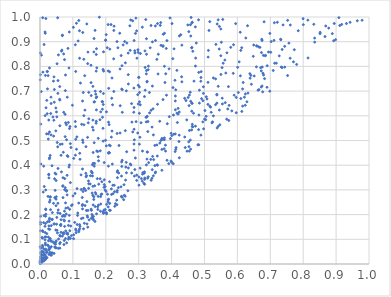
| Category | Series 0 |
|---|---|
| 0.5119025877408926 | 0.865 |
| 0.4126539866589853 | 0.464 |
| 0.009565070195917147 | 0.022 |
| 0.5110437259262518 | 0.838 |
| 0.26343760605690314 | 0.455 |
| 0.04818512540377783 | 0.632 |
| 0.31847032164182726 | 0.348 |
| 0.4196648750307523 | 0.607 |
| 0.37221815655606694 | 0.504 |
| 0.3252234285979464 | 0.737 |
| 0.4578985301840214 | 0.465 |
| 0.1725142587305596 | 0.677 |
| 0.0037070343712594517 | 0.016 |
| 0.0728381030565067 | 0.178 |
| 0.18586488468396364 | 0.281 |
| 0.5468149584931802 | 0.564 |
| 0.3110965996179899 | 0.335 |
| 0.3782162829624918 | 0.8 |
| 0.018305680623724792 | 0.632 |
| 0.07234310696253618 | 0.127 |
| 0.27947726100723885 | 0.575 |
| 0.5829646561322925 | 0.62 |
| 0.12295013277099939 | 0.733 |
| 0.274148199250739 | 0.865 |
| 0.24808586120000017 | 0.413 |
| 0.10850868623535385 | 0.78 |
| 0.1203393513211631 | 0.16 |
| 0.0896639272993858 | 0.548 |
| 0.28689535963270074 | 0.356 |
| 0.02921057819102696 | 0.43 |
| 0.16715190988454232 | 0.172 |
| 0.48984421801418226 | 0.779 |
| 0.04484551768862694 | 0.268 |
| 0.01579565165165343 | 0.127 |
| 0.4542212703960004 | 0.54 |
| 0.025391776370436273 | 0.527 |
| 0.016611433516440854 | 0.164 |
| 0.4627031396345181 | 0.65 |
| 0.16830707266852046 | 0.289 |
| 0.39629480736686873 | 0.508 |
| 0.5727819457750162 | 0.718 |
| 0.16057743324149176 | 0.278 |
| 0.285822041818848 | 0.634 |
| 0.12163234444274439 | 0.424 |
| 0.9790710817109156 | 0.987 |
| 0.3445888609127008 | 0.357 |
| 0.26216488195021453 | 0.412 |
| 0.37046815945160294 | 0.464 |
| 0.0016464650899225299 | 0.045 |
| 0.10656667648574371 | 0.286 |
| 0.006076138489974972 | 0.036 |
| 0.29850312595106554 | 0.648 |
| 0.6596730757829257 | 0.883 |
| 0.7997433507426633 | 0.993 |
| 0.10856643164775959 | 0.505 |
| 0.24748910148861322 | 0.274 |
| 0.4608443652437571 | 0.875 |
| 0.06047659159965289 | 0.064 |
| 0.6985067056871446 | 0.7 |
| 0.005953391851341842 | 0.107 |
| 0.0013565403542534341 | 0.014 |
| 0.5796616221465702 | 0.877 |
| 0.1804670981968877 | 0.999 |
| 0.019672254525324374 | 0.045 |
| 0.19841442980352123 | 0.221 |
| 0.1647067813303495 | 0.491 |
| 0.054708043080989394 | 0.743 |
| 0.14738743690725672 | 0.336 |
| 0.08935802420370768 | 0.401 |
| 0.07789127826838671 | 0.572 |
| 0.2367691939130765 | 0.875 |
| 0.4279017837008784 | 0.928 |
| 0.001234815517246652 | 0.134 |
| 0.7333494051140961 | 0.798 |
| 0.1333625994295932 | 0.601 |
| 0.1556380530285394 | 0.682 |
| 0.31589857928697695 | 0.326 |
| 0.08907305338222854 | 0.939 |
| 0.03489830999570762 | 0.092 |
| 0.19476019123073157 | 0.31 |
| 0.7112491979636713 | 0.905 |
| 0.5337613130346864 | 0.749 |
| 0.4613010239611775 | 0.619 |
| 0.36767456002003196 | 0.885 |
| 0.024291158913326137 | 0.274 |
| 0.19353175272078613 | 0.781 |
| 0.35659216999408416 | 0.437 |
| 0.0504433772494215 | 0.161 |
| 0.037685639439198455 | 0.208 |
| 0.2019842502042744 | 0.616 |
| 0.0022177023693992896 | 0.029 |
| 0.26083696338702 | 0.392 |
| 0.30212136470536155 | 0.485 |
| 0.3490182135243095 | 0.48 |
| 0.03702994257538821 | 0.18 |
| 0.5496973995938144 | 0.951 |
| 0.16431018351470741 | 0.913 |
| 0.00936817803683666 | 0.049 |
| 0.17103427520904388 | 0.848 |
| 0.3423506517497918 | 0.436 |
| 0.35878481380429406 | 0.769 |
| 0.2466917180414053 | 0.844 |
| 0.8944369424244668 | 0.974 |
| 0.06924895719642772 | 0.315 |
| 0.32726675822444207 | 0.348 |
| 0.43122927210652023 | 0.738 |
| 0.41127632143356513 | 0.66 |
| 0.019184857617721398 | 0.024 |
| 0.04431614382526744 | 0.345 |
| 0.28511302120442533 | 0.614 |
| 0.21589934618522266 | 0.969 |
| 0.2206314947919599 | 0.645 |
| 0.6510553493207257 | 0.761 |
| 0.011408317524876598 | 0.04 |
| 0.1618849035566547 | 0.542 |
| 0.3195991598963953 | 0.796 |
| 0.5105287988795942 | 0.646 |
| 0.3375737268340092 | 0.622 |
| 0.1754787284788721 | 0.455 |
| 0.14525638391060747 | 0.149 |
| 0.046558848661996347 | 0.068 |
| 0.14829771224872174 | 0.588 |
| 0.5620073145155606 | 0.826 |
| 0.30055819434844294 | 0.353 |
| 0.42327753017190967 | 0.615 |
| 0.11259605728469026 | 0.305 |
| 0.03651286200454346 | 0.398 |
| 0.0678462303275696 | 0.193 |
| 0.13300506415104935 | 0.305 |
| 0.35029162363015987 | 0.369 |
| 0.3402792603256351 | 0.347 |
| 0.3047734682660579 | 0.644 |
| 0.46808479414933096 | 0.74 |
| 0.5901718343891207 | 0.684 |
| 0.03350304918064729 | 0.092 |
| 0.35128403105923384 | 0.372 |
| 0.24866063459613566 | 0.395 |
| 0.002175744603686815 | 0.013 |
| 0.2169820490102558 | 0.304 |
| 0.243396539881631 | 0.79 |
| 0.32363610158967593 | 0.912 |
| 0.16574320402932008 | 0.657 |
| 0.10037754382586764 | 0.276 |
| 0.19315776367517873 | 0.859 |
| 0.6008149948747821 | 0.796 |
| 0.17249901423390793 | 0.458 |
| 0.6825538331252522 | 0.75 |
| 0.6256434530778168 | 0.915 |
| 0.2969572194009828 | 0.686 |
| 0.6779118630819716 | 0.772 |
| 0.6904783352809722 | 0.803 |
| 0.32561454310275517 | 0.454 |
| 0.45317856173937 | 0.641 |
| 0.05988923456390162 | 0.082 |
| 0.18870209021765158 | 0.657 |
| 0.25008428494351215 | 0.614 |
| 0.1707601973236729 | 0.781 |
| 0.010969449563899175 | 0.061 |
| 0.011510134957108684 | 0.012 |
| 0.000634772903669578 | 0.745 |
| 0.32146519776981475 | 0.99 |
| 0.048131820807391486 | 0.539 |
| 0.1294279070607893 | 0.66 |
| 0.4629860186901766 | 0.566 |
| 0.31746814972877174 | 0.373 |
| 0.12654097333734443 | 0.566 |
| 0.015963590846686394 | 0.035 |
| 0.077590350434737 | 0.765 |
| 0.015093066693773978 | 0.098 |
| 0.022567888732393526 | 0.171 |
| 0.24335558166347268 | 0.53 |
| 0.21133650093689743 | 0.45 |
| 0.008509884561067107 | 0.017 |
| 0.09583245536882434 | 0.236 |
| 0.6751061256750083 | 0.721 |
| 0.3349269679017548 | 0.875 |
| 0.2882341894508651 | 0.382 |
| 0.27572822288756726 | 0.988 |
| 0.17422953321207452 | 0.346 |
| 0.1581148729453198 | 0.201 |
| 0.0017424470095674545 | 0.161 |
| 0.017451511756296743 | 0.3 |
| 0.32812639666877363 | 0.577 |
| 0.15920163837227053 | 0.193 |
| 0.5001576625644056 | 0.586 |
| 0.1334470557814857 | 0.564 |
| 0.010561033039289652 | 0.022 |
| 0.6378051133069329 | 0.771 |
| 0.07181401330751351 | 0.197 |
| 0.355350693647943 | 0.482 |
| 0.3287728596513116 | 0.787 |
| 0.24987419152793955 | 0.42 |
| 0.06999707294775914 | 0.349 |
| 0.7437056594063286 | 0.881 |
| 0.4582626013621017 | 0.923 |
| 0.11222389191679469 | 0.515 |
| 0.0004094471046502594 | 0.006 |
| 0.29704878189023626 | 0.53 |
| 0.06829277579353878 | 0.927 |
| 0.23535272719405595 | 0.35 |
| 0.02885492335061019 | 0.251 |
| 0.5568066794734551 | 0.813 |
| 0.08893670172724344 | 0.197 |
| 0.48918071617833 | 0.522 |
| 0.04605715228672384 | 0.298 |
| 0.034193374601481044 | 0.155 |
| 0.17077007647185646 | 0.673 |
| 0.1609634303104892 | 0.185 |
| 0.24775334432427526 | 0.356 |
| 0.32893969138008683 | 0.353 |
| 0.13672651494532534 | 0.237 |
| 0.020110833533931973 | 0.527 |
| 0.28606152891036085 | 0.905 |
| 0.3738828906497835 | 0.666 |
| 0.025860534814779033 | 0.094 |
| 0.02658701137931254 | 0.363 |
| 0.08229236357473423 | 0.359 |
| 0.44936067356709053 | 0.968 |
| 0.14664094945386152 | 0.572 |
| 0.078304741175579 | 0.134 |
| 0.15942076680695513 | 0.402 |
| 0.44688629968107707 | 0.457 |
| 0.09788297940522495 | 0.24 |
| 0.13880042345691715 | 0.298 |
| 0.4617195260707267 | 0.877 |
| 0.21159388410347926 | 0.778 |
| 0.24014334994346037 | 0.48 |
| 0.18411029880315963 | 0.273 |
| 0.34165904285021714 | 0.72 |
| 0.2937941573973862 | 0.944 |
| 0.19779035479122012 | 0.208 |
| 0.5226439983433782 | 0.571 |
| 0.6685328697633524 | 0.877 |
| 0.04859044073026692 | 0.364 |
| 0.5376881155498591 | 0.684 |
| 0.08806487028936098 | 0.794 |
| 0.35690907987920967 | 0.4 |
| 0.6290411551457933 | 0.657 |
| 0.01635333483061353 | 0.085 |
| 0.1396870174083389 | 0.475 |
| 0.08300653029646834 | 0.439 |
| 0.6788843607868364 | 0.845 |
| 0.41257128233706925 | 0.705 |
| 0.23938473791691262 | 0.369 |
| 0.04953939197256884 | 0.272 |
| 0.6054033873471087 | 0.818 |
| 0.0848530957636437 | 0.435 |
| 0.19540722660060675 | 0.341 |
| 0.15885289725910082 | 0.369 |
| 0.1359016842380897 | 0.762 |
| 0.04736478461801026 | 0.067 |
| 0.20825882559556472 | 0.574 |
| 0.015097992891398179 | 0.153 |
| 0.4114345386220272 | 0.624 |
| 0.047341125564339316 | 0.08 |
| 0.615787714321102 | 0.709 |
| 0.608608995438262 | 0.938 |
| 0.07261461626549706 | 0.195 |
| 0.0037092628443344392 | 0.038 |
| 0.4197337137702663 | 0.63 |
| 0.5385244127317804 | 0.972 |
| 0.12870722507320292 | 0.237 |
| 0.6158882950862178 | 0.639 |
| 0.9084582696357356 | 0.997 |
| 0.8686328156433936 | 0.964 |
| 0.4111217828533446 | 0.527 |
| 0.3378344836950024 | 0.339 |
| 0.08019275508652228 | 0.564 |
| 0.23451624136996813 | 0.291 |
| 0.05542225644329267 | 0.063 |
| 0.2859997025382632 | 0.546 |
| 0.45681433683045963 | 0.502 |
| 0.47313437390219715 | 0.834 |
| 0.10979007905057604 | 0.127 |
| 0.2198310927938417 | 0.405 |
| 0.06972292640425558 | 0.317 |
| 0.684582309048272 | 0.843 |
| 0.2820052518222499 | 0.535 |
| 0.3265573601942448 | 0.453 |
| 0.12575853301448808 | 0.184 |
| 0.0921986203524551 | 0.104 |
| 0.07523479873742782 | 0.346 |
| 0.10966145839791895 | 0.136 |
| 0.21690603127646965 | 0.514 |
| 0.003041274448268504 | 0.031 |
| 0.20724089320595857 | 0.782 |
| 0.38221944033213073 | 0.77 |
| 0.6767941329025524 | 0.697 |
| 0.18277274220359033 | 0.345 |
| 0.37730452201460235 | 0.466 |
| 0.5498374390066204 | 0.767 |
| 0.45929689717699257 | 0.998 |
| 0.17267062664732796 | 0.794 |
| 0.6385926261290008 | 0.752 |
| 0.02666965647037719 | 0.583 |
| 0.10545570669132319 | 0.168 |
| 0.1434974990030883 | 0.195 |
| 0.0002648203481736067 | 0.011 |
| 0.10240622116886718 | 0.427 |
| 0.4612595828787801 | 0.651 |
| 0.1832593185785308 | 0.458 |
| 0.34059213466303684 | 0.554 |
| 0.21744186823131226 | 0.282 |
| 0.034350206548688464 | 0.07 |
| 0.2348164054516113 | 0.297 |
| 0.28534650953340435 | 0.712 |
| 0.21799865106841554 | 0.671 |
| 0.060417650513532054 | 0.664 |
| 0.5375323528958009 | 0.687 |
| 0.505345074809969 | 0.677 |
| 0.7358413547008256 | 0.795 |
| 0.4845688600631314 | 0.704 |
| 0.6628374982208357 | 0.704 |
| 0.42246363038744766 | 0.496 |
| 0.16416718044762035 | 0.656 |
| 0.621363357989958 | 0.675 |
| 0.08108032838674557 | 0.085 |
| 0.29832295552183413 | 0.857 |
| 0.030251744719909095 | 0.04 |
| 0.22435624291824532 | 0.946 |
| 0.3869742491046855 | 0.568 |
| 0.8349921600626847 | 0.898 |
| 0.4101883012805646 | 0.744 |
| 0.2763129423719349 | 0.401 |
| 0.5416301655421153 | 0.719 |
| 0.35520314739228687 | 0.829 |
| 0.0152343085936756 | 0.939 |
| 0.14180216196875486 | 0.358 |
| 0.16152528690430418 | 0.451 |
| 0.12090002591049649 | 0.448 |
| 0.22513693809405147 | 0.963 |
| 0.08642359507752541 | 0.156 |
| 0.6582756085474463 | 0.883 |
| 0.001399626325250455 | 0.169 |
| 0.4527185062061699 | 0.475 |
| 0.16935116851072637 | 0.688 |
| 0.15346751867697958 | 0.357 |
| 0.03495626838817911 | 0.044 |
| 0.055466286403926174 | 0.219 |
| 0.037537518315668275 | 0.045 |
| 0.13321844687074277 | 0.829 |
| 0.736013128202757 | 0.869 |
| 0.006864084755586312 | 0.017 |
| 0.1393781493040843 | 0.367 |
| 0.07376919352349569 | 0.095 |
| 0.056447604624395464 | 0.101 |
| 0.20859234375638613 | 0.262 |
| 0.16147497000465205 | 0.239 |
| 0.3559202495919378 | 0.402 |
| 0.7704546456594943 | 0.819 |
| 0.6727039984287759 | 0.782 |
| 0.17854569251584557 | 0.323 |
| 0.017235374896973205 | 0.06 |
| 0.381262984285593 | 0.481 |
| 0.04854451704879168 | 0.065 |
| 0.15502561102072857 | 0.805 |
| 0.6482444465606437 | 0.841 |
| 0.505035530985839 | 0.598 |
| 0.0023876020571259433 | 0.064 |
| 0.20250939844900454 | 0.241 |
| 0.1291899217069096 | 0.223 |
| 0.3231530579167611 | 0.77 |
| 0.46096349873190307 | 0.543 |
| 0.19164709403144212 | 0.787 |
| 0.152494113873365 | 0.324 |
| 0.2787078919743129 | 0.368 |
| 0.08075487833713073 | 0.503 |
| 0.03933452390075098 | 0.595 |
| 0.009866969920087511 | 0.291 |
| 0.23434469942188307 | 0.528 |
| 0.041099834656729436 | 0.246 |
| 0.016936966042778123 | 0.021 |
| 0.11487108880088974 | 0.207 |
| 0.35706023100677275 | 0.973 |
| 0.003817160134326135 | 0.698 |
| 0.061280624625293496 | 0.484 |
| 0.02119686439829206 | 0.051 |
| 0.6899873137264857 | 0.715 |
| 0.10149338470921843 | 0.958 |
| 0.4236532475713053 | 0.923 |
| 0.16342269391453854 | 0.261 |
| 0.4617342693364552 | 0.976 |
| 0.2073815140779814 | 0.231 |
| 0.4967979850893599 | 0.691 |
| 0.011188034589063608 | 0.396 |
| 0.3655030199314582 | 0.966 |
| 0.9111040774311845 | 0.965 |
| 0.05420528049050486 | 0.207 |
| 0.016051689586159545 | 0.934 |
| 0.5451701809489183 | 0.623 |
| 0.033449197109880514 | 0.045 |
| 0.05116341986218598 | 0.595 |
| 0.1998119466610441 | 0.906 |
| 0.016783342468885177 | 0.193 |
| 0.3229951153416494 | 0.575 |
| 0.30244040841129205 | 0.657 |
| 0.04870789144958133 | 0.236 |
| 0.3572503183947781 | 0.646 |
| 0.07644700577471909 | 0.516 |
| 0.025244600835683008 | 0.506 |
| 0.34172922751923607 | 0.899 |
| 0.3007559921670924 | 0.319 |
| 0.2079439287879211 | 0.396 |
| 0.12030030223746355 | 0.833 |
| 0.0021778973867751573 | 0.004 |
| 0.6322055057857713 | 0.692 |
| 0.39504324579080174 | 0.996 |
| 0.6646443769147434 | 0.879 |
| 0.3051790285139276 | 0.852 |
| 0.23814846066662718 | 0.309 |
| 0.012522708436066513 | 0.196 |
| 0.060121102954758254 | 0.116 |
| 0.16083348459789695 | 0.719 |
| 0.08494250527833493 | 0.873 |
| 0.45733976968642553 | 0.969 |
| 0.016481263622723837 | 0.078 |
| 0.20813085655112068 | 0.449 |
| 0.18790171475178008 | 0.333 |
| 0.38607910988482735 | 0.42 |
| 0.21381011809164166 | 0.217 |
| 0.5378280875495637 | 0.651 |
| 0.08093891957767563 | 0.124 |
| 0.32958947303038627 | 0.801 |
| 0.5270079719103179 | 0.753 |
| 0.11771438844446999 | 0.247 |
| 0.21020941244225297 | 0.564 |
| 0.10201607455340203 | 0.103 |
| 0.4949310825144498 | 0.575 |
| 0.1347632439413392 | 0.306 |
| 0.04152653394231292 | 0.518 |
| 0.1637221985143313 | 0.859 |
| 0.19528678944353 | 0.322 |
| 0.674106183091517 | 0.91 |
| 0.07087757597298121 | 0.452 |
| 0.07856145275751708 | 0.226 |
| 0.2256539610422358 | 0.319 |
| 0.06759523297045913 | 0.113 |
| 0.14285245275920094 | 0.162 |
| 0.06033461841585103 | 0.56 |
| 0.39307910455996115 | 0.596 |
| 0.04480798396259616 | 0.069 |
| 0.18379275080695387 | 0.698 |
| 0.8775777111136971 | 0.955 |
| 0.2589363164141588 | 0.274 |
| 0.41356108365169725 | 0.471 |
| 0.16165466184821847 | 0.408 |
| 0.6654380147494998 | 0.706 |
| 0.0544339824790113 | 0.246 |
| 0.0075434627764937616 | 0.105 |
| 0.36688386988956767 | 0.977 |
| 0.30246962121540044 | 0.694 |
| 0.41625060372894135 | 0.611 |
| 0.40433042148692555 | 0.714 |
| 0.030037413645071207 | 0.271 |
| 0.6945513420017883 | 0.858 |
| 0.13484903168236695 | 0.165 |
| 0.2681767002112646 | 0.766 |
| 0.06522471693725095 | 0.373 |
| 0.4645047254388044 | 0.861 |
| 0.03258641240373043 | 0.609 |
| 0.053095544209165055 | 0.126 |
| 0.7027166227109121 | 0.9 |
| 0.10760853804880795 | 0.441 |
| 0.481881749344008 | 0.988 |
| 0.04365929605174955 | 0.706 |
| 0.1285526040197429 | 0.269 |
| 0.3128080279760649 | 0.37 |
| 0.30716761420157324 | 0.572 |
| 0.054371108849126 | 0.691 |
| 0.17526548181605417 | 0.232 |
| 0.3411816591878207 | 0.382 |
| 0.07661540465742397 | 0.309 |
| 0.5447138858335147 | 0.87 |
| 0.02945160129042038 | 0.101 |
| 0.34466082838096473 | 0.523 |
| 0.2543655813098325 | 0.26 |
| 0.002781493390021903 | 0.004 |
| 0.1291973008235955 | 0.384 |
| 0.007221373105458038 | 0.015 |
| 0.2024016482095336 | 0.203 |
| 0.20062728254044726 | 0.294 |
| 0.18789113484764905 | 0.283 |
| 0.01777542895111595 | 0.994 |
| 0.20121804458563783 | 0.928 |
| 0.5883265017633058 | 0.888 |
| 0.1992526875269352 | 0.906 |
| 0.3302446132343225 | 0.411 |
| 0.03094632198391362 | 0.439 |
| 0.016433444168173935 | 0.018 |
| 0.325913338434521 | 0.598 |
| 0.004862630239668517 | 0.025 |
| 0.0745118293988425 | 0.827 |
| 0.04083064023991616 | 0.089 |
| 0.04344018380055098 | 0.655 |
| 0.2526594031753545 | 0.887 |
| 0.145785222225389 | 0.858 |
| 0.17149460492770244 | 0.624 |
| 0.10237089573268382 | 0.118 |
| 0.5161635147486351 | 0.639 |
| 0.8512288364114696 | 0.932 |
| 0.20882069157666608 | 0.711 |
| 0.14497557408836817 | 0.811 |
| 0.020515341736702084 | 0.662 |
| 0.06998883549552534 | 0.269 |
| 0.20516054260563507 | 0.283 |
| 0.008125808134776836 | 0.997 |
| 0.08834525775312733 | 0.174 |
| 0.21185803614552728 | 0.245 |
| 0.8147760725973411 | 0.834 |
| 0.4830976954002983 | 0.603 |
| 0.4004622640326524 | 0.52 |
| 0.03371539695690574 | 0.523 |
| 0.30044785370990257 | 0.756 |
| 0.09228575334590165 | 0.487 |
| 0.07438669474136972 | 0.214 |
| 0.023229277108440128 | 0.076 |
| 0.5674198701176871 | 0.586 |
| 0.05184560427259476 | 0.811 |
| 0.13992555700975184 | 0.353 |
| 0.5159634637167063 | 0.981 |
| 0.17189947355133428 | 0.203 |
| 0.1635270160371911 | 0.272 |
| 0.7603523217637737 | 0.833 |
| 0.016504887313659802 | 0.025 |
| 0.0008887716860405292 | 0.854 |
| 0.09847902268960723 | 0.643 |
| 0.08733921930685155 | 0.109 |
| 0.5512206136905444 | 0.898 |
| 0.032701731498771903 | 0.039 |
| 0.1177063735889306 | 0.131 |
| 0.5136579719969685 | 0.946 |
| 0.02651844997811519 | 0.361 |
| 0.37404696894008577 | 0.884 |
| 0.383890302284335 | 0.873 |
| 0.6731611594237886 | 0.856 |
| 0.13066794446934493 | 0.492 |
| 0.5707524460521933 | 0.628 |
| 0.24964877977232153 | 0.27 |
| 0.8985048384331639 | 0.908 |
| 0.01508079601105445 | 0.109 |
| 0.07277302284641207 | 0.079 |
| 0.32413215976887605 | 0.595 |
| 0.1298480987475435 | 0.937 |
| 0.3234370704070773 | 0.401 |
| 0.30810903686156726 | 0.346 |
| 0.44608430868448334 | 0.583 |
| 0.03069741887815056 | 0.259 |
| 0.4161494964240467 | 0.784 |
| 0.05475604304116135 | 0.387 |
| 0.0632977719703333 | 0.161 |
| 0.2857323042574735 | 0.486 |
| 0.2680546268259798 | 0.854 |
| 0.22665023577971638 | 0.293 |
| 0.2501775315261669 | 0.706 |
| 0.2868048761358317 | 0.503 |
| 0.021975160347029708 | 0.609 |
| 0.5947629214218213 | 0.973 |
| 0.12954233136119467 | 0.502 |
| 0.010907640907357994 | 0.047 |
| 0.11424440292863632 | 0.197 |
| 0.4521144587428363 | 0.494 |
| 0.40567568265051357 | 0.603 |
| 0.03711960862446037 | 0.181 |
| 0.5748055146880731 | 0.642 |
| 0.3110629390575425 | 0.959 |
| 0.02981009047206582 | 0.047 |
| 0.17586423127007306 | 0.221 |
| 0.004334310546971132 | 0.012 |
| 0.5873863508035803 | 0.772 |
| 0.26719050306134984 | 0.296 |
| 0.20431088032634662 | 0.876 |
| 0.4910705452878402 | 0.67 |
| 0.3182523361921545 | 0.343 |
| 0.20160559215302626 | 0.478 |
| 0.8926110417871895 | 0.904 |
| 0.033461182207861886 | 0.676 |
| 0.3746334741681611 | 0.93 |
| 0.00180098233260313 | 0.193 |
| 0.16607911604840073 | 0.407 |
| 0.7013486792437984 | 0.857 |
| 0.5336778596576254 | 0.645 |
| 0.3221126867257388 | 0.594 |
| 0.15749310974844832 | 0.372 |
| 0.08648059708759845 | 0.101 |
| 0.07417491389510074 | 0.175 |
| 0.14462354624766666 | 0.513 |
| 0.21146400261443993 | 0.333 |
| 0.08063672278745616 | 0.298 |
| 0.6425117996900976 | 0.728 |
| 0.22438947847782023 | 0.699 |
| 0.14800838370767097 | 0.325 |
| 0.03377964575759851 | 0.65 |
| 0.5076887622582814 | 0.668 |
| 0.1981398652102093 | 0.3 |
| 0.021919847210912086 | 0.779 |
| 0.028199215330484258 | 0.058 |
| 0.22395197808650927 | 0.831 |
| 0.6854693458514062 | 0.845 |
| 0.01793199858793693 | 0.202 |
| 0.11092211584452301 | 0.465 |
| 0.06669268994965362 | 0.866 |
| 0.20712938937324166 | 0.26 |
| 0.0019719305772069947 | 0.013 |
| 0.059654440982426615 | 0.667 |
| 0.48881980808402015 | 0.74 |
| 0.06113110584735408 | 0.205 |
| 0.8004509590277683 | 0.969 |
| 0.15962847226587304 | 0.357 |
| 0.3257646704992114 | 0.739 |
| 0.018050422360845163 | 0.11 |
| 0.23589461333320455 | 0.377 |
| 0.8515190692153647 | 0.938 |
| 0.7123553661041809 | 0.977 |
| 0.7800359212132929 | 0.808 |
| 0.013108906902420205 | 0.015 |
| 0.2437278628655846 | 0.641 |
| 0.31166045997408537 | 0.364 |
| 0.21883501952330403 | 0.753 |
| 0.7525752876856481 | 0.763 |
| 0.0409144162962448 | 0.74 |
| 0.1199924598440301 | 0.944 |
| 0.28167856588186146 | 0.985 |
| 0.04217700214319442 | 0.582 |
| 0.13237889215392448 | 0.142 |
| 0.061655033630296646 | 0.087 |
| 0.06529378943025309 | 0.862 |
| 0.6811408095468146 | 0.981 |
| 0.25633151810845956 | 0.278 |
| 0.26866432624260445 | 0.389 |
| 0.02895383882514682 | 0.185 |
| 0.3367770408363697 | 0.423 |
| 0.02065117333314252 | 0.123 |
| 0.12062786119194596 | 0.144 |
| 0.0328815681568438 | 0.036 |
| 0.2489371564486788 | 0.272 |
| 0.23316471564217162 | 0.258 |
| 0.009767776606807495 | 0.037 |
| 0.17675961372463875 | 0.274 |
| 0.6103676005829145 | 0.67 |
| 0.377735770125877 | 0.503 |
| 0.3737180963554378 | 0.881 |
| 0.5270558364990511 | 0.6 |
| 0.5736727826802192 | 0.581 |
| 0.4966784519552093 | 0.717 |
| 0.26267928387188316 | 0.369 |
| 0.2624578935247974 | 0.701 |
| 0.649570209826908 | 0.887 |
| 0.4824581570508458 | 0.483 |
| 0.5554647727325513 | 0.99 |
| 0.0011991425044818168 | 0.766 |
| 0.3639860634244314 | 0.578 |
| 0.23406948543970427 | 0.9 |
| 0.16487708941147444 | 0.396 |
| 0.4176226330865687 | 0.573 |
| 0.16755998007922085 | 0.233 |
| 0.7609093307076606 | 0.968 |
| 0.05003634795712376 | 0.616 |
| 0.04269212479000982 | 0.043 |
| 0.7132202745315991 | 0.813 |
| 0.09023349572021676 | 0.221 |
| 0.1477717561530883 | 0.306 |
| 0.06377989616023219 | 0.128 |
| 0.0029672827021058334 | 0.405 |
| 0.005283331739317353 | 0.052 |
| 0.15521900018066181 | 0.734 |
| 0.7313871513795225 | 0.91 |
| 0.034580218884701176 | 0.036 |
| 0.4107977661918043 | 0.455 |
| 0.15526882717124987 | 0.222 |
| 0.25535230060029457 | 0.321 |
| 0.029546793235916944 | 0.14 |
| 0.1625430804723346 | 0.179 |
| 0.2219920262600012 | 0.285 |
| 0.14806809275603386 | 0.695 |
| 0.2685666854970543 | 0.729 |
| 0.44006902781225193 | 0.514 |
| 0.3435876021747725 | 0.628 |
| 0.09115750454789942 | 0.556 |
| 0.02621604767322211 | 0.142 |
| 0.22932753026944533 | 0.244 |
| 0.13658090574327583 | 0.623 |
| 0.16086129377248373 | 0.583 |
| 0.19259463200036356 | 0.205 |
| 0.16784802473392132 | 0.7 |
| 0.640993495078941 | 0.763 |
| 0.12468240123196761 | 0.361 |
| 0.027135785430455348 | 0.349 |
| 0.4750387422268574 | 0.894 |
| 0.012958248993146784 | 0.314 |
| 0.04219877902007154 | 0.162 |
| 0.9314000586749029 | 0.974 |
| 0.015652296253199822 | 0.601 |
| 0.2422977113397788 | 0.934 |
| 0.2945653895341419 | 0.833 |
| 0.4005476672534912 | 0.412 |
| 0.22736935441402747 | 0.234 |
| 0.025523137864823908 | 0.109 |
| 0.05388401456926864 | 0.474 |
| 0.3985834898518054 | 0.529 |
| 0.2090666912033722 | 0.452 |
| 0.19166311598427238 | 0.549 |
| 0.1445697227279166 | 0.19 |
| 0.1837177241452626 | 0.214 |
| 0.34551484291664974 | 0.423 |
| 0.2122737557513951 | 0.87 |
| 0.06288610519821913 | 0.155 |
| 0.41143952063315775 | 0.68 |
| 0.07557770986055087 | 0.193 |
| 0.16735897061921604 | 0.946 |
| 0.17799699116071666 | 0.418 |
| 0.2938819273885025 | 0.338 |
| 0.08067716838639453 | 0.295 |
| 0.29213495438125187 | 0.576 |
| 0.30209833023582044 | 0.61 |
| 0.1770580219953459 | 0.509 |
| 0.07737779525636003 | 0.103 |
| 0.3037586737352349 | 0.513 |
| 0.6724577678535893 | 0.717 |
| 0.1559860789320192 | 0.185 |
| 0.04255692758553022 | 0.758 |
| 0.4439202197671891 | 0.662 |
| 0.013045228328405746 | 0.028 |
| 0.264098637248372 | 0.895 |
| 0.19191447046629334 | 0.497 |
| 0.47247734635771144 | 0.558 |
| 0.23466408212699166 | 0.372 |
| 0.4312067532780555 | 0.886 |
| 0.08480474006689222 | 0.228 |
| 0.9426608756638202 | 0.978 |
| 0.4234467132157485 | 0.43 |
| 0.28808238969250544 | 0.863 |
| 0.7388099722785652 | 0.968 |
| 0.28852734443643213 | 0.854 |
| 0.08243994361489633 | 0.28 |
| 0.19431651109126374 | 0.218 |
| 0.27426846631381746 | 0.405 |
| 0.1701807561891778 | 0.283 |
| 0.12928309585169753 | 0.241 |
| 0.2593454525241208 | 0.54 |
| 0.5682059394739846 | 0.855 |
| 0.2856484056749165 | 0.461 |
| 0.7438640358605002 | 0.797 |
| 0.05106600561396942 | 0.189 |
| 0.3374771909012174 | 0.966 |
| 0.5963922642682795 | 0.674 |
| 0.4522624318405269 | 0.941 |
| 0.18462221135101467 | 0.616 |
| 0.553388730445805 | 0.795 |
| 0.3277356699684836 | 0.536 |
| 0.052326818266876726 | 0.492 |
| 0.009019309679915773 | 0.131 |
| 0.5544155492505385 | 0.648 |
| 0.3780961342379617 | 0.511 |
| 0.24923788899572538 | 0.803 |
| 0.007557429599568284 | 0.076 |
| 0.0008177192929067425 | 0.02 |
| 0.17119089532545 | 0.578 |
| 0.0012542380046242706 | 0.003 |
| 0.006104024661860046 | 0.007 |
| 0.5647935633461825 | 0.773 |
| 0.8348519267813949 | 0.915 |
| 0.0640251490151296 | 0.44 |
| 0.6749071868713349 | 0.905 |
| 0.10850691998237533 | 0.141 |
| 0.11079395859985341 | 0.975 |
| 0.08285231903271599 | 0.675 |
| 0.04940457935458145 | 0.093 |
| 0.016312320906599148 | 0.763 |
| 0.4972638054039446 | 0.547 |
| 0.25950427612939564 | 0.814 |
| 0.18965286570806003 | 0.627 |
| 0.16619540977622474 | 0.317 |
| 0.0003750267914636393 | 0.07 |
| 0.008254090063414113 | 0.069 |
| 0.010866028885772058 | 0.168 |
| 0.42306463473897743 | 0.522 |
| 0.4074499136165502 | 0.871 |
| 0.09350817003344469 | 0.154 |
| 0.018308987027934362 | 0.028 |
| 0.0246050812671328 | 0.763 |
| 0.02118822047269239 | 0.026 |
| 0.6131827823847666 | 0.876 |
| 0.06999276402844595 | 0.126 |
| 0.5538781354653924 | 0.671 |
| 0.756615307314189 | 0.894 |
| 0.6029440688327964 | 0.694 |
| 0.36426669744959356 | 0.49 |
| 0.14248755854270842 | 0.253 |
| 0.005247220816090491 | 0.02 |
| 0.16073871793317623 | 0.314 |
| 0.06398009846211371 | 0.179 |
| 0.3669431690088451 | 0.5 |
| 0.07209792175139677 | 0.614 |
| 0.4567638929704794 | 0.695 |
| 0.2730911220641428 | 0.964 |
| 0.20190712213155002 | 0.208 |
| 0.30439601019840085 | 0.388 |
| 0.19229067084927276 | 0.646 |
| 0.2189032327175917 | 0.538 |
| 0.7850043953881026 | 0.944 |
| 0.11594641502387706 | 0.903 |
| 0.012461090242397915 | 0.889 |
| 0.6239884273059765 | 0.643 |
| 0.016828917360566388 | 0.056 |
| 0.21367314861855455 | 0.479 |
| 0.6795206681530115 | 0.765 |
| 0.10735955018260236 | 0.577 |
| 0.260194898228366 | 0.34 |
| 0.379784316867482 | 0.735 |
| 0.7215060680224438 | 0.979 |
| 0.09235348056710017 | 0.329 |
| 0.9645635365947578 | 0.985 |
| 0.031980747519888345 | 0.067 |
| 0.07119891056716933 | 0.121 |
| 0.2066962266964484 | 0.251 |
| 0.5631520772441698 | 0.653 |
| 0.5415469692472146 | 0.988 |
| 0.07487531400257405 | 0.152 |
| 0.10810475622194919 | 0.556 |
| 0.17052188692131107 | 0.57 |
| 0.14100499091508403 | 0.217 |
| 0.3980771178671082 | 0.417 |
| 0.2573324955920995 | 0.901 |
| 0.6308605544589155 | 0.965 |
| 0.3491368853787195 | 0.398 |
| 0.6134589917192028 | 0.618 |
| 0.08614975920872617 | 0.573 |
| 0.44150822593938893 | 0.471 |
| 0.11876998846047593 | 0.137 |
| 0.29018218167215815 | 0.934 |
| 0.7526973583971422 | 0.986 |
| 0.06233603248259095 | 0.158 |
| 0.008746518877926802 | 0.777 |
| 0.5416741357912312 | 0.557 |
| 0.3594742516623988 | 0.849 |
| 0.2898793723545322 | 0.429 |
| 0.43048543157935837 | 0.758 |
| 0.22137908752508853 | 0.319 |
| 0.2915401076926841 | 0.995 |
| 0.6103037953081553 | 0.865 |
| 0.4067007943278121 | 0.525 |
| 0.7271464931885764 | 0.843 |
| 0.06157651102914005 | 0.113 |
| 0.9169568618155162 | 0.97 |
| 0.1770967555327736 | 0.434 |
| 0.11303720265058903 | 0.16 |
| 0.17168369912294185 | 0.872 |
| 0.027213028357387953 | 0.154 |
| 0.4799735161583358 | 0.483 |
| 0.07633488146694137 | 0.606 |
| 0.0023031043587857887 | 0.566 |
| 0.49522902407179026 | 0.661 |
| 0.4724498568200291 | 0.801 |
| 0.37049164273126717 | 0.38 |
| 0.67055970293071 | 0.795 |
| 0.15958243757847648 | 0.554 |
| 0.017233307720987415 | 0.222 |
| 0.2977943407888369 | 0.867 |
| 0.1991992424636506 | 0.501 |
| 0.332574495416315 | 0.694 |
| 0.17773228090754767 | 0.238 |
| 0.05601782457319147 | 0.847 |
| 0.05366697448184272 | 0.997 |
| 0.24842873270485158 | 0.708 |
| 0.1623376448420328 | 0.192 |
| 0.8886646957752454 | 0.933 |
| 0.4665520784465878 | 0.61 |
| 0.40129199369715135 | 0.973 |
| 0.12163541027996899 | 0.153 |
| 0.48247786288488353 | 0.776 |
| 0.003802200511570426 | 0.025 |
| 0.40373967554019596 | 0.831 |
| 0.1914240347076312 | 0.211 |
| 0.02701755848864285 | 0.039 |
| 0.19504058586930395 | 0.411 |
| 0.6091525412106698 | 0.762 |
| 0.31141955746156796 | 0.457 |
| 0.31970529076945364 | 0.704 |
| 0.4628276708434548 | 0.557 |
| 0.14923798783903988 | 0.178 |
| 0.8322404169230848 | 0.971 |
| 0.09409132905768389 | 0.472 |
| 0.4050918566638575 | 0.406 |
| 0.03206053519131155 | 0.22 |
| 0.3251869541221089 | 0.425 |
| 0.18998243753650843 | 0.594 |
| 0.5963972228749339 | 0.612 |
| 0.04703710227464427 | 0.088 |
| 0.03183314911115122 | 0.272 |
| 0.1848727182322883 | 0.243 |
| 0.02847186941843875 | 0.426 |
| 0.31900588957206816 | 0.863 |
| 0.1560143346949201 | 0.375 |
| 0.049000195438189696 | 0.338 |
| 0.3914242501745195 | 0.406 |
| 0.01756320019077441 | 0.22 |
| 0.294000122406957 | 0.36 |
| 0.6243540733921732 | 0.689 |
| 0.1901547328709307 | 0.657 |
| 0.19811063682164748 | 0.313 |
| 0.5012551152781115 | 0.621 |
| 0.29974203824844614 | 0.755 |
| 0.004362667444830644 | 0.846 |
| 0.5347494014322957 | 0.889 |
| 0.4537024675461274 | 0.457 |
| 0.0906129747397926 | 0.135 |
| 0.6986645390745208 | 0.934 |
| 0.866224518785469 | 0.921 |
| 0.02247772513253976 | 0.779 |
| 0.13087977369452763 | 0.186 |
| 0.3816450813040098 | 0.457 |
| 0.30196795567832374 | 0.717 |
| 0.05176411944292206 | 0.136 |
| 0.7183584639799084 | 0.813 |
| 0.2112478324300587 | 0.218 |
| 0.08433388188461073 | 0.121 |
| 0.46445137961261485 | 0.555 |
| 0.15840310065925844 | 0.287 |
| 0.13161287112695474 | 0.694 |
| 0.0009269113539452972 | 0.011 |
| 0.3175148173649451 | 0.678 |
| 0.33298466198671833 | 0.612 |
| 0.43964995127945505 | 0.671 |
| 0.022768729055936476 | 0.709 |
| 0.814168229753779 | 0.987 |
| 0.08402108807277847 | 0.124 |
| 0.12522197770065777 | 0.302 |
| 0.10744217776759922 | 0.888 |
| 0.7089001322884739 | 0.783 |
| 0.07706685226443902 | 0.702 |
| 0.45024305676563975 | 0.674 |
| 0.007595315976539718 | 0.135 |
| 0.07971401731429395 | 0.202 |
| 0.5452545155602754 | 0.962 |
| 0.04375346172524147 | 0.162 |
| 0.07191482645846944 | 0.851 |
| 0.04882175528229876 | 0.262 |
| 0.35104884669147085 | 0.905 |
| 0.38447110721327254 | 0.683 |
| 0.48209525894295724 | 0.544 |
| 0.3704562659124295 | 0.508 |
| 0.21033887970839907 | 0.481 |
| 0.04568595918291686 | 0.368 |
| 0.3784917614898349 | 0.934 |
| 0.4893707721036732 | 0.755 |
| 0.07766276680192065 | 0.247 |
| 0.4722234003396919 | 0.96 |
| 0.31806089954169126 | 0.323 |
| 0.028898694380358643 | 0.794 |
| 0.32355555462943236 | 0.783 |
| 0.5036323409393609 | 0.584 |
| 0.0880298450113223 | 0.392 |
| 0.11786782837676399 | 0.986 |
| 0.20704144083070977 | 0.969 |
| 0.031267593652668346 | 0.103 |
| 0.026322696175800936 | 0.059 |
| 0.6578258038155768 | 0.798 |
| 0.3507426190908963 | 0.964 |
| 0.028445202856088512 | 0.18 |
| 0.14231468476525724 | 0.972 |
| 0.2338767290445249 | 0.24 |
| 0.524517092486472 | 0.575 |
| 0.06785860601699914 | 0.925 |
| 0.18231525682916222 | 0.584 |
| 0.05994713052626532 | 0.718 |
| 0.06738260889378928 | 0.486 |
| 0.0009986406558183784 | 0.001 |
| 0.1309483727091984 | 0.294 |
| 0.07495366272729512 | 0.301 |
| 0.5496275631017374 | 0.843 |
| 0.0480501509340357 | 0.138 |
| 0.27832202925191996 | 0.649 |
| 0.0029803387147648752 | 0.028 |
| 0.5186056776521066 | 0.635 |
| 0.6176127949896123 | 0.735 |
| 0.24626727597579384 | 0.312 |
| 0.028406758935160165 | 0.172 |
| 0.4581094942053968 | 0.659 |
| 0.7320230918548385 | 0.908 |
| 0.31704994648788015 | 0.368 |
| 0.09557738021805776 | 0.115 |
| 0.3858295815368563 | 0.904 |
| 0.5202703702871697 | 0.614 |
| 0.32370366518330523 | 0.849 |
| 0.5106656177009823 | 0.735 |
| 0.3923671691023854 | 0.79 |
| 0.029021486055033945 | 0.535 |
| 0.462987802707936 | 0.979 |
| 0.5384303305187393 | 0.551 |
| 0.0433005890722037 | 0.084 |
| 0.1927458638523535 | 0.69 |
| 0.45404083662280414 | 0.684 |
| 0.7730642150601361 | 0.868 |
| 0.29863603086637885 | 0.724 |
| 0.02458157707312912 | 0.075 |
| 0.1564440410755396 | 0.217 |
| 0.4844577934301266 | 0.651 |
| 0.6755343635259364 | 0.798 |
| 0.14567464373152098 | 0.217 |
| 0.02816953279475626 | 0.068 |